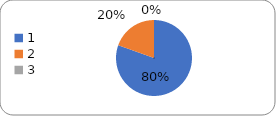
| Category | Series 0 |
|---|---|
| 0 | 103 |
| 1 | 25 |
| 2 | 0 |